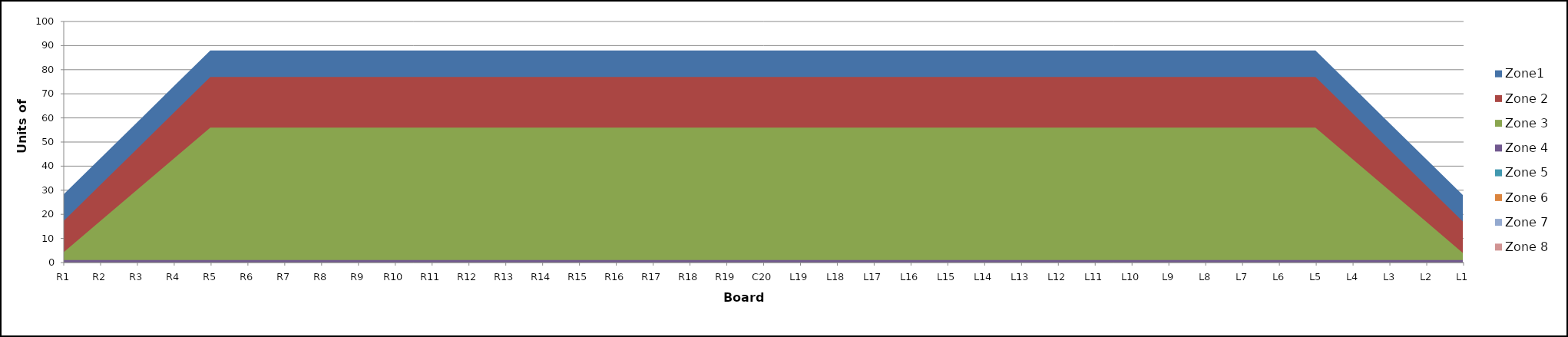
| Category | Zone1 | Zone 2 | Zone 3 | Zone 4 | Zone 5 | Zone 6 | Zone 7 | Zone 8 |
|---|---|---|---|---|---|---|---|---|
| L1 | 28 | 17 | 4 | 1 |  |  |  |  |
| L2 | 43 | 32 | 17 | 1 |  |  |  |  |
| L3 | 58 | 47 | 30 | 1 |  |  |  |  |
| L4 | 73 | 62 | 43 | 1 |  |  |  |  |
| L5 | 88 | 77 | 56 | 1 |  |  |  |  |
| L6 | 88 | 77 | 56 | 1 |  |  |  |  |
| L7 | 88 | 77 | 56 | 1 |  |  |  |  |
| L8 | 88 | 77 | 56 | 1 |  |  |  |  |
| L9 | 88 | 77 | 56 | 1 |  |  |  |  |
| L10 | 88 | 77 | 56 | 1 |  |  |  |  |
| L11 | 88 | 77 | 56 | 1 |  |  |  |  |
| L12 | 88 | 77 | 56 | 1 |  |  |  |  |
| L13 | 88 | 77 | 56 | 1 |  |  |  |  |
| L14 | 88 | 77 | 56 | 1 |  |  |  |  |
| L15 | 88 | 77 | 56 | 1 |  |  |  |  |
| L16 | 88 | 77 | 56 | 1 |  |  |  |  |
| L17 | 88 | 77 | 56 | 1 |  |  |  |  |
| L18 | 88 | 77 | 56 | 1 |  |  |  |  |
| L19 | 88 | 77 | 56 | 1 |  |  |  |  |
| C20 | 88 | 77 | 56 | 1 |  |  |  |  |
| R19 | 88 | 77 | 56 | 1 |  |  |  |  |
| R18 | 88 | 77 | 56 | 1 |  |  |  |  |
| R17 | 88 | 77 | 56 | 1 |  |  |  |  |
| R16 | 88 | 77 | 56 | 1 |  |  |  |  |
| R15 | 88 | 77 | 56 | 1 |  |  |  |  |
| R14 | 88 | 77 | 56 | 1 |  |  |  |  |
| R13 | 88 | 77 | 56 | 1 |  |  |  |  |
| R12 | 88 | 77 | 56 | 1 |  |  |  |  |
| R11 | 88 | 77 | 56 | 1 |  |  |  |  |
| R10 | 88 | 77 | 56 | 1 |  |  |  |  |
| R9 | 88 | 77 | 56 | 1 |  |  |  |  |
| R8 | 88 | 77 | 56 | 1 |  |  |  |  |
| R7 | 88 | 77 | 56 | 1 |  |  |  |  |
| R6 | 88 | 77 | 56 | 1 |  |  |  |  |
| R5 | 88 | 77 | 56 | 1 |  |  |  |  |
| R4 | 73 | 62 | 43 | 1 |  |  |  |  |
| R3 | 58 | 47 | 30 | 1 |  |  |  |  |
| R2 | 43 | 32 | 17 | 1 |  |  |  |  |
| R1 | 28 | 17 | 4 | 1 |  |  |  |  |